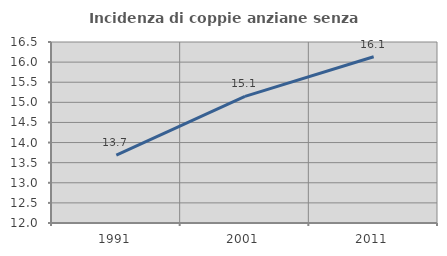
| Category | Incidenza di coppie anziane senza figli  |
|---|---|
| 1991.0 | 13.687 |
| 2001.0 | 15.147 |
| 2011.0 | 16.134 |